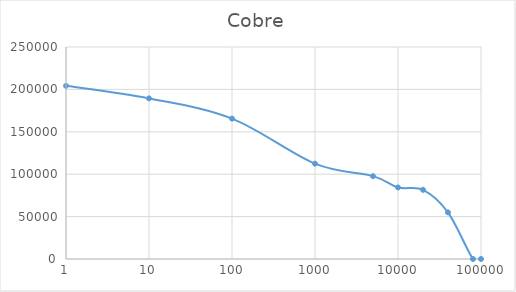
| Category | Cobre |
|---|---|
| 1.0 | 204174.012 |
| 10.0 | 189388.76 |
| 100.0 | 165546.486 |
| 1000.0 | 112417.75 |
| 5000.0 | 97684.969 |
| 10000.0 | 84338.329 |
| 20000.0 | 81582.26 |
| 40000.0 | 54976.842 |
| 80000.0 | 0 |
| 100000.0 | 0 |